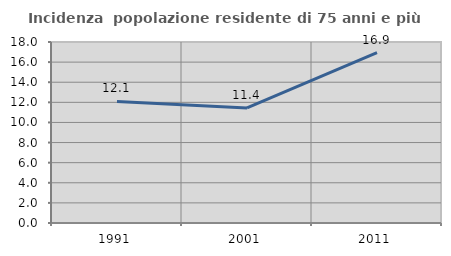
| Category | Incidenza  popolazione residente di 75 anni e più |
|---|---|
| 1991.0 | 12.094 |
| 2001.0 | 11.447 |
| 2011.0 | 16.945 |